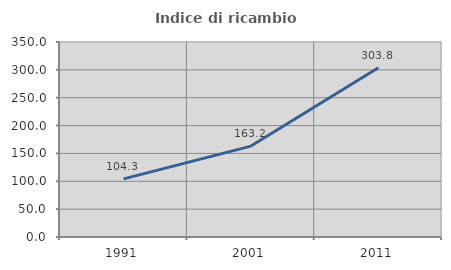
| Category | Indice di ricambio occupazionale  |
|---|---|
| 1991.0 | 104.306 |
| 2001.0 | 163.175 |
| 2011.0 | 303.782 |